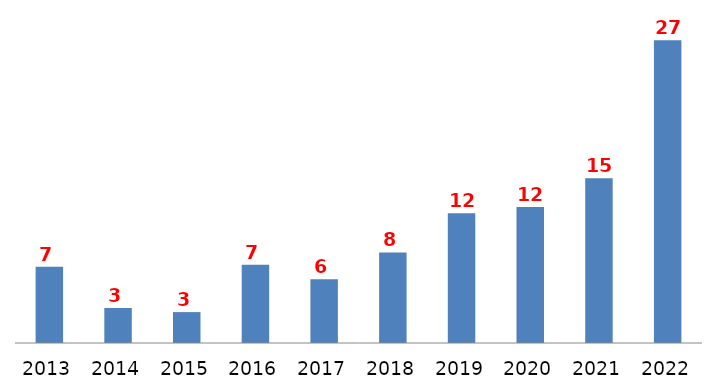
| Category | Series 0 |
|---|---|
| 2013.0 | 6.865 |
| 2014.0 | 3.154 |
| 2015.0 | 2.783 |
| 2016.0 | 7.05 |
| 2017.0 | 5.751 |
| 2018.0 | 8.163 |
| 2019.0 | 11.688 |
| 2020.0 | 12.245 |
| 2021.0 | 14.842 |
| 2022.0 | 27.273 |